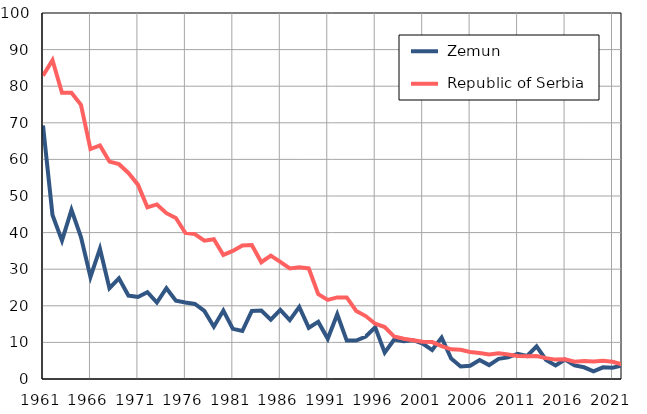
| Category |  Zemun |  Republic of Serbia |
|---|---|---|
| 1961.0 | 69.3 | 82.9 |
| 1962.0 | 44.8 | 87.1 |
| 1963.0 | 37.8 | 78.2 |
| 1964.0 | 46.2 | 78.2 |
| 1965.0 | 38.8 | 74.9 |
| 1966.0 | 27.9 | 62.8 |
| 1967.0 | 35.6 | 63.8 |
| 1968.0 | 24.8 | 59.4 |
| 1969.0 | 27.5 | 58.7 |
| 1970.0 | 22.8 | 56.3 |
| 1971.0 | 22.4 | 53.1 |
| 1972.0 | 23.7 | 46.9 |
| 1973.0 | 20.9 | 47.7 |
| 1974.0 | 24.8 | 45.3 |
| 1975.0 | 21.4 | 44 |
| 1976.0 | 20.9 | 39.9 |
| 1977.0 | 20.5 | 39.6 |
| 1978.0 | 18.6 | 37.8 |
| 1979.0 | 14.3 | 38.2 |
| 1980.0 | 18.7 | 33.9 |
| 1981.0 | 13.7 | 35 |
| 1982.0 | 13.1 | 36.5 |
| 1983.0 | 18.6 | 36.6 |
| 1984.0 | 18.7 | 31.9 |
| 1985.0 | 16.2 | 33.7 |
| 1986.0 | 18.9 | 32 |
| 1987.0 | 16.1 | 30.2 |
| 1988.0 | 19.7 | 30.5 |
| 1989.0 | 14 | 30.2 |
| 1990.0 | 15.6 | 23.2 |
| 1991.0 | 11 | 21.6 |
| 1992.0 | 17.7 | 22.3 |
| 1993.0 | 10.5 | 22.3 |
| 1994.0 | 10.5 | 18.6 |
| 1995.0 | 11.6 | 17.2 |
| 1996.0 | 14.1 | 15.1 |
| 1997.0 | 7.2 | 14.2 |
| 1998.0 | 10.8 | 11.6 |
| 1999.0 | 10.3 | 11 |
| 2000.0 | 10.6 | 10.6 |
| 2001.0 | 9.7 | 10.2 |
| 2002.0 | 7.9 | 10.1 |
| 2003.0 | 11.3 | 9 |
| 2004.0 | 5.6 | 8.1 |
| 2005.0 | 3.4 | 8 |
| 2006.0 | 3.6 | 7.4 |
| 2007.0 | 5.2 | 7.1 |
| 2008.0 | 3.8 | 6.7 |
| 2009.0 | 5.5 | 7 |
| 2010.0 | 5.9 | 6.7 |
| 2011.0 | 6.9 | 6.3 |
| 2012.0 | 6.3 | 6.2 |
| 2013.0 | 8.9 | 6.3 |
| 2014.0 | 5.2 | 5.7 |
| 2015.0 | 3.7 | 5.3 |
| 2016.0 | 5.3 | 5.4 |
| 2017.0 | 3.7 | 4.7 |
| 2018.0 | 3.2 | 4.9 |
| 2019.0 | 2.1 | 4.8 |
| 2020.0 | 3.2 | 5 |
| 2021.0 | 3.1 | 4.7 |
| 2022.0 | 3.7 | 4 |